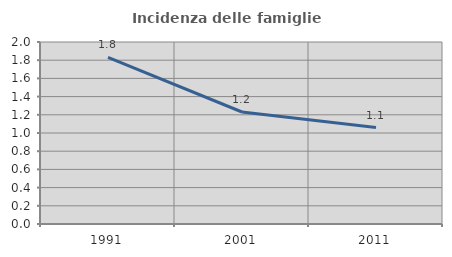
| Category | Incidenza delle famiglie numerose |
|---|---|
| 1991.0 | 1.831 |
| 2001.0 | 1.231 |
| 2011.0 | 1.06 |